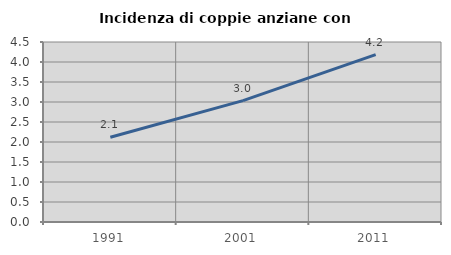
| Category | Incidenza di coppie anziane con figli |
|---|---|
| 1991.0 | 2.12 |
| 2001.0 | 3.035 |
| 2011.0 | 4.183 |